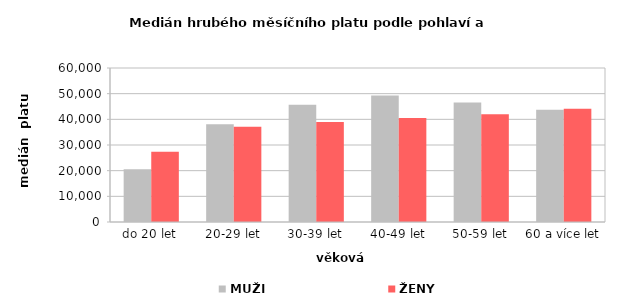
| Category | MUŽI | ŽENY |
|---|---|---|
| 0 | 20561.944 | 27409.058 |
| 1 | 38121.292 | 37096.333 |
| 2 | 45691.434 | 38945.625 |
| 3 | 49310.633 | 40503.456 |
| 4 | 46600.557 | 41971.551 |
| 5 | 43762.332 | 44158.578 |